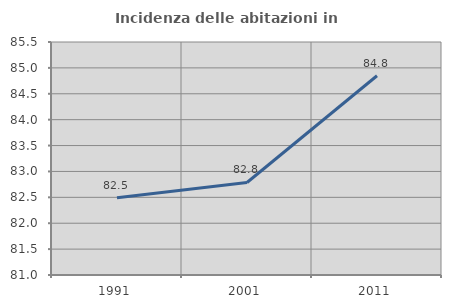
| Category | Incidenza delle abitazioni in proprietà  |
|---|---|
| 1991.0 | 82.49 |
| 2001.0 | 82.787 |
| 2011.0 | 84.848 |